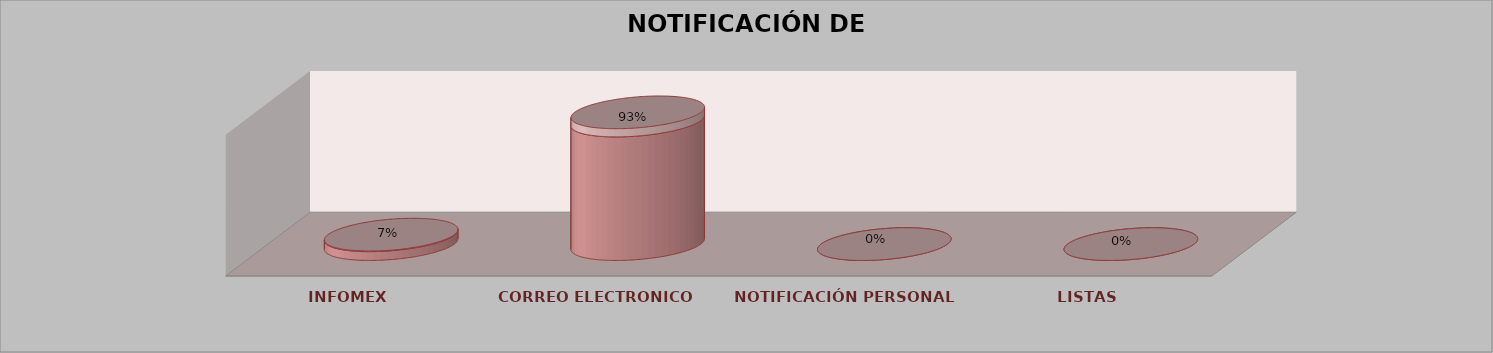
| Category | Series 0 | Series 1 | Series 2 | Series 3 | Series 4 |
|---|---|---|---|---|---|
| INFOMEX |  |  |  | 1 | 0.07 |
| CORREO ELECTRONICO |  |  |  | 14 | 0.93 |
| NOTIFICACIÓN PERSONAL |  |  |  | 0 | 0 |
| LISTAS |  |  |  | 0 | 0 |